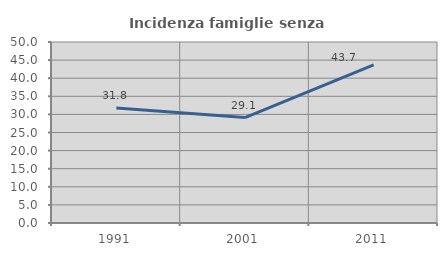
| Category | Incidenza famiglie senza nuclei |
|---|---|
| 1991.0 | 31.776 |
| 2001.0 | 29.123 |
| 2011.0 | 43.662 |